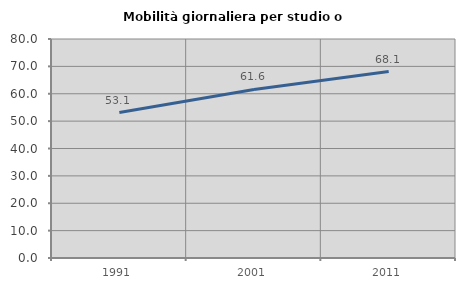
| Category | Mobilità giornaliera per studio o lavoro |
|---|---|
| 1991.0 | 53.125 |
| 2001.0 | 61.56 |
| 2011.0 | 68.089 |